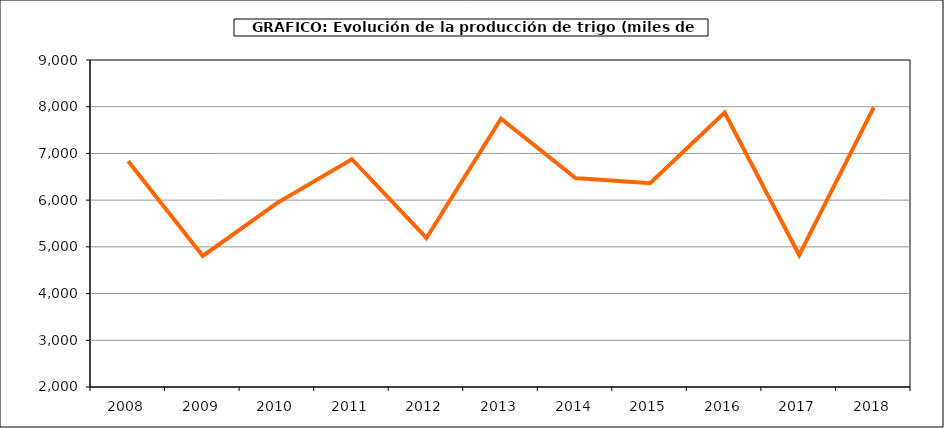
| Category | Producción |
|---|---|
| 2008.0 | 6831.461 |
| 2009.0 | 4804.772 |
| 2010.0 | 5941.197 |
| 2011.0 | 6876.651 |
| 2012.0 | 5189.828 |
| 2013.0 | 7744.928 |
| 2014.0 | 6472.734 |
| 2015.0 | 6362.692 |
| 2016.0 | 7873.135 |
| 2017.0 | 4825.109 |
| 2018.0 | 7985.7 |